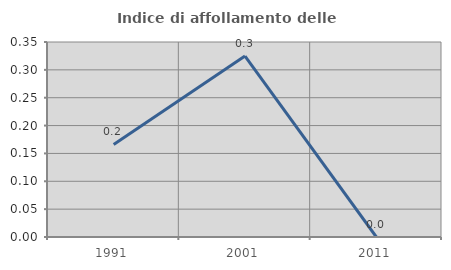
| Category | Indice di affollamento delle abitazioni  |
|---|---|
| 1991.0 | 0.166 |
| 2001.0 | 0.325 |
| 2011.0 | 0 |